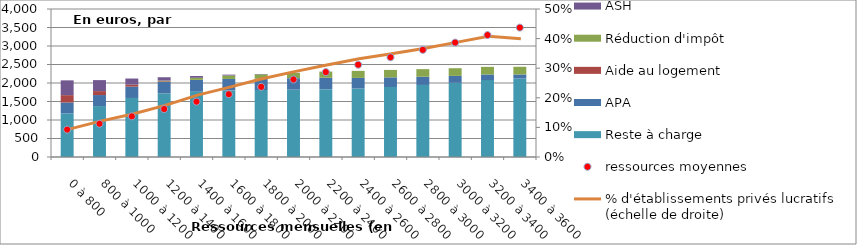
| Category | Reste à charge | APA | Aide au logement | Réduction d'impôt | ASH |
|---|---|---|---|---|---|
| 0 à 800 | 1179.91 | 293.446 | 198.225 | 0 | 399.636 |
| 800 à 1000 | 1376.5 | 298.036 | 105.938 | 0.28 | 297.111 |
| 1000 à 1200 | 1595.75 | 307.003 | 47.227 | 4.479 | 166.242 |
| 1200 à 1400 | 1719.77 | 309.907 | 17.134 | 18.892 | 89.938 |
| 1400 à 1600 | 1774.04 | 308.702 | 2.421 | 56.057 | 47.432 |
| 1600 à 1800 | 1799.97 | 309.562 | 0.198 | 92.706 | 24.035 |
| 1800 à 2000 | 1809.85 | 306.407 | 0.186 | 116.465 | 10.472 |
| 2000 à 2200 | 1822.61 | 307.119 | 0.114 | 139.836 | 6.068 |
| 2200 à 2400 | 1834.39 | 307.129 | 0.111 | 164.003 | 2.769 |
| 2400 à 2600 | 1851.57 | 286.487 | 0.052 | 188.603 | 0.923 |
| 2600 à 2800 | 1892.13 | 260.555 | 0.067 | 200.722 | 0.566 |
| 2800 à 3000 | 1947.39 | 222.077 | 0.031 | 205.043 | 0.066 |
| 3000 à 3200 | 2005.69 | 186.67 | 0.061 | 206.855 | 0.228 |
| 3200 à 3400 | 2078.48 | 151.615 | 0.256 | 205.926 | 0 |
| 3400 à 3600 | 2117.89 | 112.776 | 0 | 207.623 | 0 |